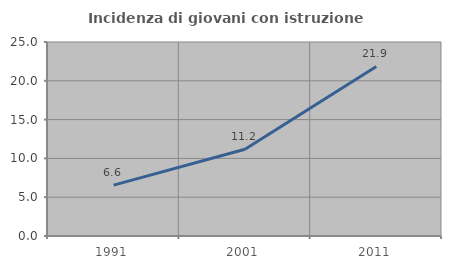
| Category | Incidenza di giovani con istruzione universitaria |
|---|---|
| 1991.0 | 6.555 |
| 2001.0 | 11.182 |
| 2011.0 | 21.852 |